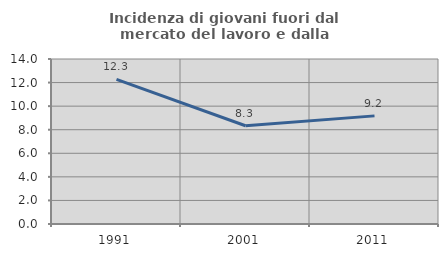
| Category | Incidenza di giovani fuori dal mercato del lavoro e dalla formazione  |
|---|---|
| 1991.0 | 12.264 |
| 2001.0 | 8.333 |
| 2011.0 | 9.174 |